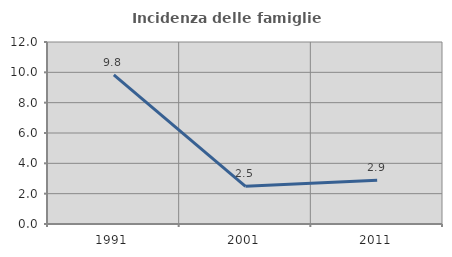
| Category | Incidenza delle famiglie numerose |
|---|---|
| 1991.0 | 9.829 |
| 2001.0 | 2.482 |
| 2011.0 | 2.878 |